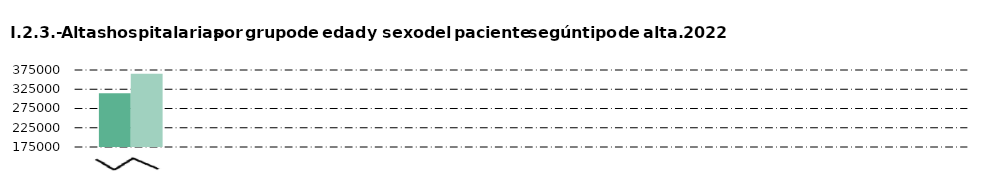
| Category |     Hombre |     Mujer |
|---|---|---|
| Alta Médica | 314707 | 365118 |
| Traslado a otro hospital | 6112 | 5083 |
| Alta voluntaria | 1944 | 1406 |
| Fallecimiento | 11975 | 11753 |
| Traslado a centro socio-sanitario | 2279 | 2336 |
| Fuga | 265 | 169 |
| Traslado a hospitalizacion convencional desde cirugía ambulatoria | 4737 | 4163 |
| Otros | 337 | 427 |